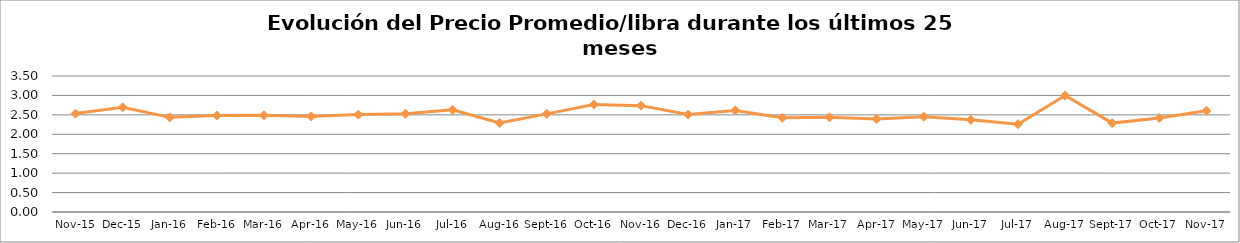
| Category | Series 0 |
|---|---|
| 2015-11-01 | 2.532 |
| 2015-12-01 | 2.693 |
| 2016-01-01 | 2.436 |
| 2016-02-01 | 2.484 |
| 2016-03-01 | 2.488 |
| 2016-04-01 | 2.46 |
| 2016-05-01 | 2.506 |
| 2016-06-01 | 2.527 |
| 2016-07-01 | 2.631 |
| 2016-08-01 | 2.292 |
| 2016-09-01 | 2.525 |
| 2016-10-01 | 2.764 |
| 2016-11-01 | 2.737 |
| 2016-12-01 | 2.508 |
| 2017-01-01 | 2.615 |
| 2017-02-01 | 2.424 |
| 2017-03-01 | 2.436 |
| 2017-04-01 | 2.396 |
| 2017-05-01 | 2.452 |
| 2017-06-01 | 2.372 |
| 2017-07-01 | 2.26 |
| 2017-08-01 | 2.997 |
| 2017-09-01 | 2.288 |
| 2017-10-01 | 2.421 |
| 2017-11-01 | 2.605 |